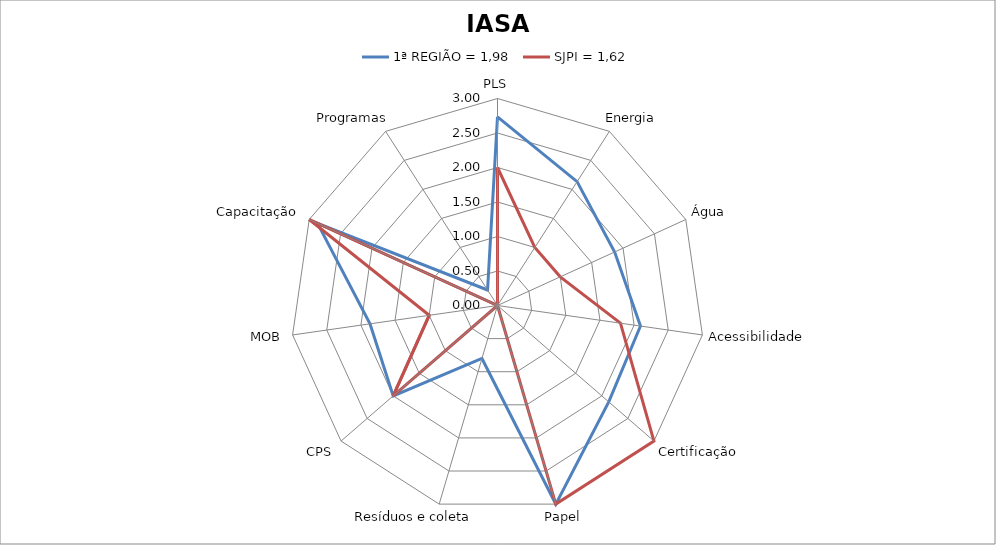
| Category | 1ª REGIÃO = 1,98 | SJPI = 1,62 |
|---|---|---|
| PLS | 2.733 | 2 |
| Energia | 2.133 | 1 |
| Água | 1.867 | 1 |
| Acessibilidade | 2.093 | 1.8 |
| Certificação | 2.133 | 3 |
| Papel | 3 | 3 |
| Resíduos e coleta | 0.8 | 0 |
| CPS | 2 | 2 |
| MOB | 1.867 | 1 |
| Capacitação | 2.867 | 3 |
| Programas | 0.267 | 0 |